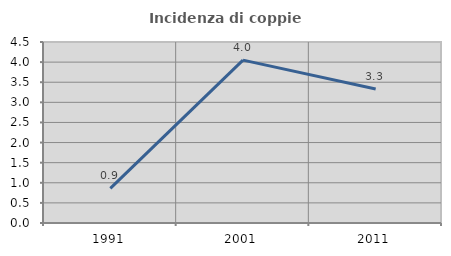
| Category | Incidenza di coppie miste |
|---|---|
| 1991.0 | 0.862 |
| 2001.0 | 4.049 |
| 2011.0 | 3.333 |